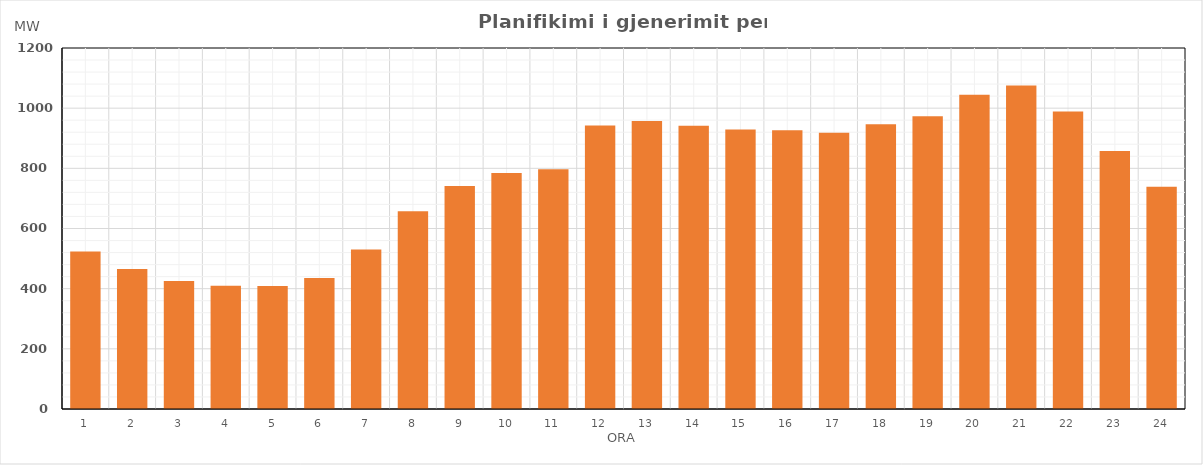
| Category | Max (MW) |
|---|---|
| 0 | 523.39 |
| 1 | 465.49 |
| 2 | 425.67 |
| 3 | 409.28 |
| 4 | 408.95 |
| 5 | 435.78 |
| 6 | 530.1 |
| 7 | 657.41 |
| 8 | 741.21 |
| 9 | 784.11 |
| 10 | 797.2 |
| 11 | 942.16 |
| 12 | 957.39 |
| 13 | 941.76 |
| 14 | 928.73 |
| 15 | 926.94 |
| 16 | 918.01 |
| 17 | 946.71 |
| 18 | 972.86 |
| 19 | 1044.66 |
| 20 | 1075.14 |
| 21 | 988.63 |
| 22 | 857.52 |
| 23 | 738.6 |